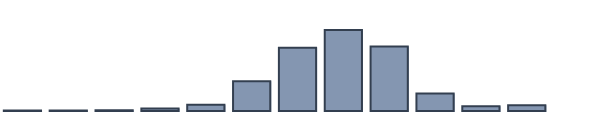
| Category | Series 0 |
|---|---|
| 0 | 0.174 |
| 1 | 0.217 |
| 2 | 0.304 |
| 3 | 0.913 |
| 4 | 2.261 |
| 5 | 10.696 |
| 6 | 22.826 |
| 7 | 29.174 |
| 8 | 23.261 |
| 9 | 6.348 |
| 10 | 1.739 |
| 11 | 2.087 |
| 12 | 0 |